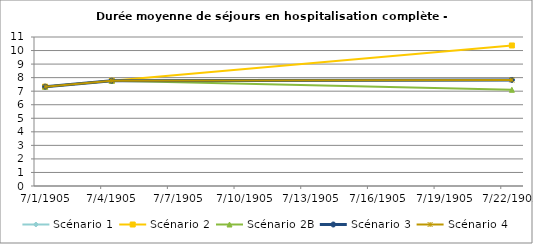
| Category | Scénario 1 | Scénario 2 | Scénario 2B | Scénario 3 | Scénario 4 |
|---|---|---|---|---|---|
| 2009.0 | 7.336 | 7.336 | 7.336 | 7.336 | 7.336 |
| 2012.0 | 7.771 | 7.771 | 7.771 | 7.771 | 7.771 |
| 2030.0 | 7.83 | 10.374 | 7.103 | 7.83 | 7.83 |